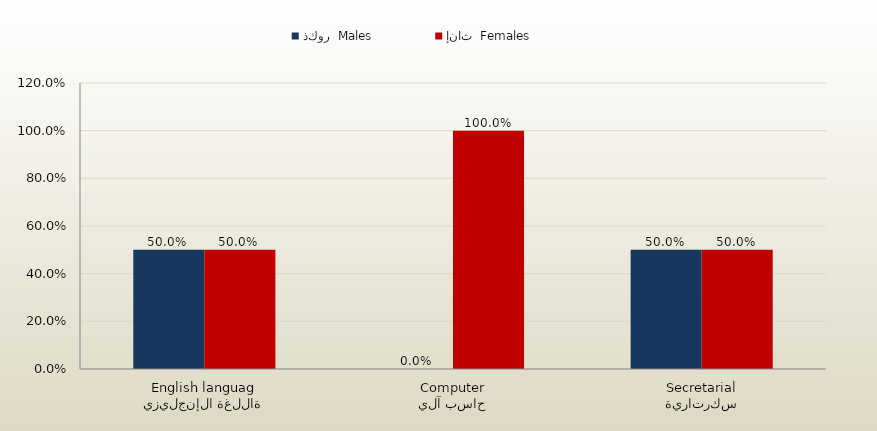
| Category | ذكور  Males | إناث  Females |
|---|---|---|
| اللغة الإنجليزية
English language | 0.5 | 0.5 |
| حاسب آلي
Computer | 0 | 1 |
| سكرتارية
Secretarial | 0.5 | 0.5 |